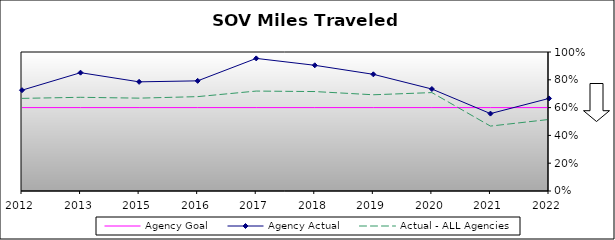
| Category | Agency Goal | Agency Actual | Actual - ALL Agencies |
|---|---|---|---|
| 2012.0 | 0.6 | 0.725 | 0.666 |
| 2013.0 | 0.6 | 0.851 | 0.674 |
| 2015.0 | 0.6 | 0.785 | 0.668 |
| 2016.0 | 0.6 | 0.792 | 0.679 |
| 2017.0 | 0.6 | 0.954 | 0.719 |
| 2018.0 | 0.6 | 0.904 | 0.715 |
| 2019.0 | 0.6 | 0.839 | 0.692 |
| 2020.0 | 0.6 | 0.734 | 0.708 |
| 2021.0 | 0.6 | 0.557 | 0.467 |
| 2022.0 | 0.6 | 0.666 | 0.515 |